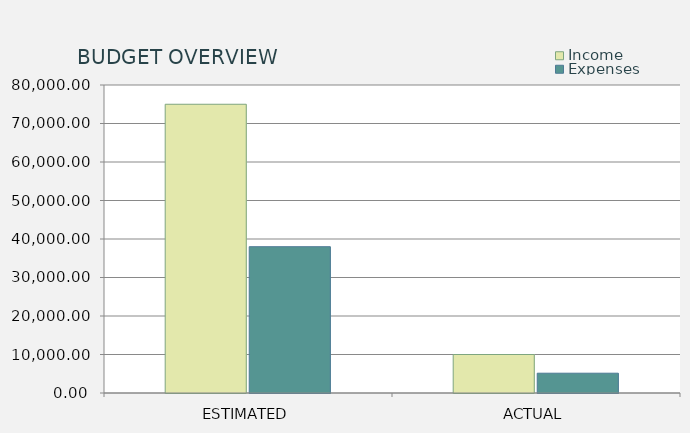
| Category | Income | Expenses |
|---|---|---|
| ESTIMATED | 75000 | 38000 |
| ACTUAL | 10000 | 5140 |